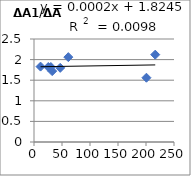
| Category | ΔA1/ΔA2 |
|---|---|
| 25.5 | 1.82 |
| 61.3 | 2.06 |
| 11.7 | 1.83 |
| 216.5 | 2.12 |
| 46.8 | 1.8 |
| 32.5 | 1.72 |
| 200.8 | 1.56 |
| 30.1 | 1.82 |